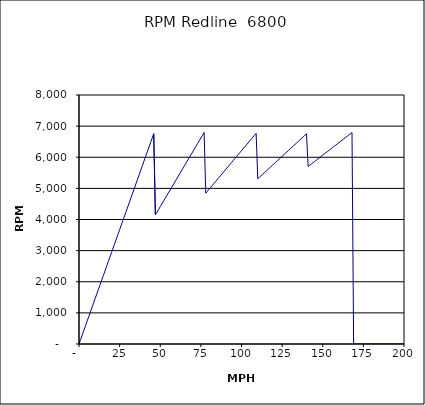
| Category | RPM Redline  6800 |
|---|---|
| 0.0 | 0 |
| 1.0 | 146.894 |
| 2.0 | 293.787 |
| 3.0 | 440.681 |
| 4.0 | 587.574 |
| 5.0 | 734.468 |
| 6.0 | 881.362 |
| 7.0 | 1028.255 |
| 8.0 | 1175.149 |
| 9.0 | 1322.042 |
| 10.0 | 1468.936 |
| 11.0 | 1615.83 |
| 12.0 | 1762.723 |
| 13.0 | 1909.617 |
| 14.0 | 2056.51 |
| 15.0 | 2203.404 |
| 16.0 | 2350.298 |
| 17.0 | 2497.191 |
| 18.0 | 2644.085 |
| 19.0 | 2790.978 |
| 20.0 | 2937.872 |
| 21.0 | 3084.766 |
| 22.0 | 3231.659 |
| 23.0 | 3378.553 |
| 24.0 | 3525.446 |
| 25.0 | 3672.34 |
| 26.0 | 3819.234 |
| 27.0 | 3966.127 |
| 28.0 | 4113.021 |
| 29.0 | 4259.914 |
| 30.0 | 4406.808 |
| 31.0 | 4553.702 |
| 32.0 | 4700.595 |
| 33.0 | 4847.489 |
| 34.0 | 4994.382 |
| 35.0 | 5141.276 |
| 36.0 | 5288.17 |
| 37.0 | 5435.063 |
| 38.0 | 5581.957 |
| 39.0 | 5728.85 |
| 40.0 | 5875.744 |
| 41.0 | 6022.638 |
| 42.0 | 6169.531 |
| 43.0 | 6316.425 |
| 44.0 | 6463.318 |
| 45.0 | 6610.212 |
| 46.0 | 6757.106 |
| 47.0 | 4147.717 |
| 48.0 | 4235.966 |
| 49.0 | 4324.216 |
| 50.0 | 4412.465 |
| 51.0 | 4500.714 |
| 52.0 | 4588.964 |
| 53.0 | 4677.213 |
| 54.0 | 4765.462 |
| 55.0 | 4853.711 |
| 56.0 | 4941.961 |
| 57.0 | 5030.21 |
| 58.0 | 5118.459 |
| 59.0 | 5206.709 |
| 60.0 | 5294.958 |
| 61.0 | 5383.207 |
| 62.0 | 5471.457 |
| 63.0 | 5559.706 |
| 64.0 | 5647.955 |
| 65.0 | 5736.204 |
| 66.0 | 5824.454 |
| 67.0 | 5912.703 |
| 68.0 | 6000.952 |
| 69.0 | 6089.202 |
| 70.0 | 6177.451 |
| 71.0 | 6265.7 |
| 72.0 | 6353.95 |
| 73.0 | 6442.199 |
| 74.0 | 6530.448 |
| 75.0 | 6618.697 |
| 76.0 | 6706.947 |
| 77.0 | 6795.196 |
| 78.0 | 4843.906 |
| 79.0 | 4906.007 |
| 80.0 | 4968.109 |
| 81.0 | 5030.21 |
| 82.0 | 5092.311 |
| 83.0 | 5154.413 |
| 84.0 | 5216.514 |
| 85.0 | 5278.616 |
| 86.0 | 5340.717 |
| 87.0 | 5402.818 |
| 88.0 | 5464.92 |
| 89.0 | 5527.021 |
| 90.0 | 5589.122 |
| 91.0 | 5651.224 |
| 92.0 | 5713.325 |
| 93.0 | 5775.426 |
| 94.0 | 5837.528 |
| 95.0 | 5899.629 |
| 96.0 | 5961.73 |
| 97.0 | 6023.832 |
| 98.0 | 6085.933 |
| 99.0 | 6148.035 |
| 100.0 | 6210.136 |
| 101.0 | 6272.237 |
| 102.0 | 6334.339 |
| 103.0 | 6396.44 |
| 104.0 | 6458.541 |
| 105.0 | 6520.643 |
| 106.0 | 6582.744 |
| 107.0 | 6644.845 |
| 108.0 | 6706.947 |
| 109.0 | 6769.048 |
| 110.0 | 5306.339 |
| 111.0 | 5354.579 |
| 112.0 | 5402.818 |
| 113.0 | 5451.058 |
| 114.0 | 5499.297 |
| 115.0 | 5547.537 |
| 116.0 | 5595.776 |
| 117.0 | 5644.015 |
| 118.0 | 5692.255 |
| 119.0 | 5740.494 |
| 120.0 | 5788.734 |
| 121.0 | 5836.973 |
| 122.0 | 5885.213 |
| 123.0 | 5933.452 |
| 124.0 | 5981.692 |
| 125.0 | 6029.931 |
| 126.0 | 6078.171 |
| 127.0 | 6126.41 |
| 128.0 | 6174.649 |
| 129.0 | 6222.889 |
| 130.0 | 6271.128 |
| 131.0 | 6319.368 |
| 132.0 | 6367.607 |
| 133.0 | 6415.847 |
| 134.0 | 6464.086 |
| 135.0 | 6512.326 |
| 136.0 | 6560.565 |
| 137.0 | 6608.804 |
| 138.0 | 6657.044 |
| 139.0 | 6705.283 |
| 140.0 | 6753.523 |
| 141.0 | 5703.111 |
| 142.0 | 5743.559 |
| 143.0 | 5784.006 |
| 144.0 | 5824.454 |
| 145.0 | 5864.901 |
| 146.0 | 5905.349 |
| 147.0 | 5945.797 |
| 148.0 | 5986.244 |
| 149.0 | 6026.692 |
| 150.0 | 6067.139 |
| 151.0 | 6107.587 |
| 152.0 | 6148.035 |
| 153.0 | 6188.482 |
| 154.0 | 6228.93 |
| 155.0 | 6269.377 |
| 156.0 | 6309.825 |
| 157.0 | 6350.273 |
| 158.0 | 6390.72 |
| 159.0 | 6431.168 |
| 160.0 | 6471.615 |
| 161.0 | 6512.063 |
| 162.0 | 6552.511 |
| 163.0 | 6592.958 |
| 164.0 | 6633.406 |
| 165.0 | 6673.853 |
| 166.0 | 6714.301 |
| 167.0 | 6754.748 |
| 168.0 | 6795.196 |
| 169.0 | 0 |
| 170.0 | 0 |
| 171.0 | 0 |
| 172.0 | 0 |
| 173.0 | 0 |
| 174.0 | 0 |
| 175.0 | 0 |
| 176.0 | 0 |
| 177.0 | 0 |
| 178.0 | 0 |
| 179.0 | 0 |
| 180.0 | 0 |
| 181.0 | 0 |
| 182.0 | 0 |
| 183.0 | 0 |
| 184.0 | 0 |
| 185.0 | 0 |
| 186.0 | 0 |
| 187.0 | 0 |
| 188.0 | 0 |
| 189.0 | 0 |
| 190.0 | 0 |
| 191.0 | 0 |
| 192.0 | 0 |
| 193.0 | 0 |
| 194.0 | 0 |
| 195.0 | 0 |
| 196.0 | 0 |
| 197.0 | 0 |
| 198.0 | 0 |
| 199.0 | 0 |
| 200.0 | 0 |